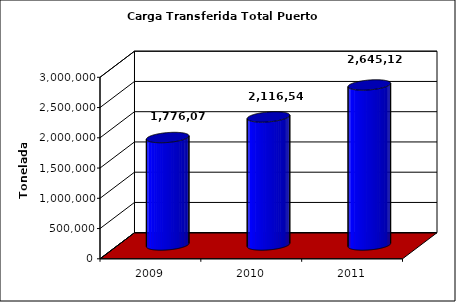
| Category | Series 0 |
|---|---|
| 2009.0 | 1776070 |
| 2010.0 | 2116548 |
| 2011.0 | 2645121 |